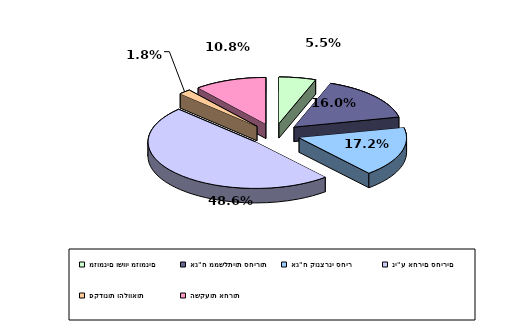
| Category | Series 0 |
|---|---|
| מזומנים ושווי מזומנים | 0.055 |
| אג"ח ממשלתיות סחירות | 0.16 |
| אג"ח קונצרני סחיר | 0.172 |
| ני"ע אחרים סחירים | 0.486 |
| פקדונות והלוואות | 0.018 |
| השקעות אחרות | 0.108 |